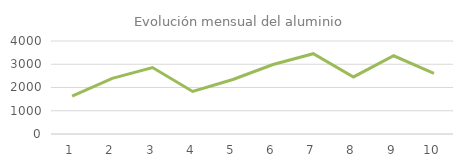
| Category | Series 0 |
|---|---|
| 0 | 1626.925 |
| 1 | 2393.51 |
| 2 | 2856.77 |
| 3 | 1830.98 |
| 4 | 2343.875 |
| 5 | 2988.16 |
| 6 | 3453.905 |
| 7 | 2454.175 |
| 8 | 3364.15 |
| 9 | 2608.595 |